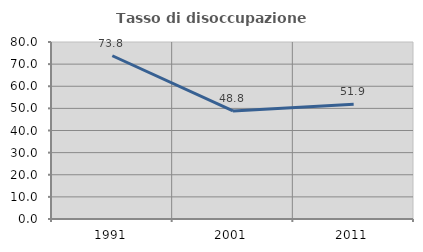
| Category | Tasso di disoccupazione giovanile  |
|---|---|
| 1991.0 | 73.788 |
| 2001.0 | 48.832 |
| 2011.0 | 51.907 |